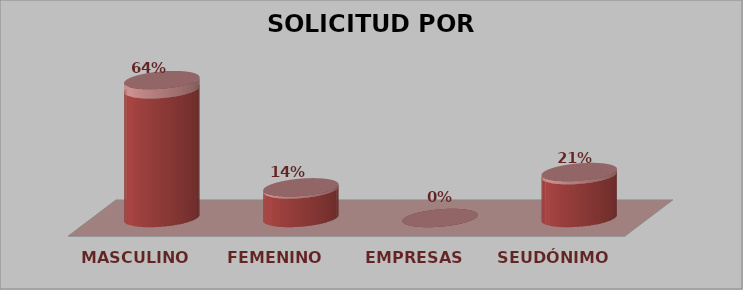
| Category | SOLICITUD POR SEXO | Series 1 |
|---|---|---|
| MASCULINO | 9 | 0.643 |
| FEMENINO | 2 | 0.143 |
| EMPRESAS | 0 | 0 |
| SEUDÓNIMO | 3 | 0.214 |